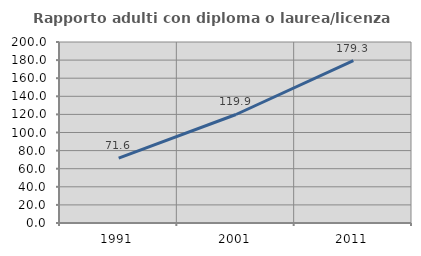
| Category | Rapporto adulti con diploma o laurea/licenza media  |
|---|---|
| 1991.0 | 71.645 |
| 2001.0 | 119.891 |
| 2011.0 | 179.343 |